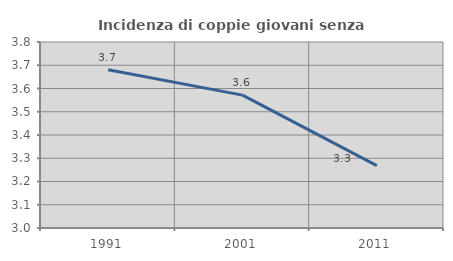
| Category | Incidenza di coppie giovani senza figli |
|---|---|
| 1991.0 | 3.681 |
| 2001.0 | 3.571 |
| 2011.0 | 3.268 |